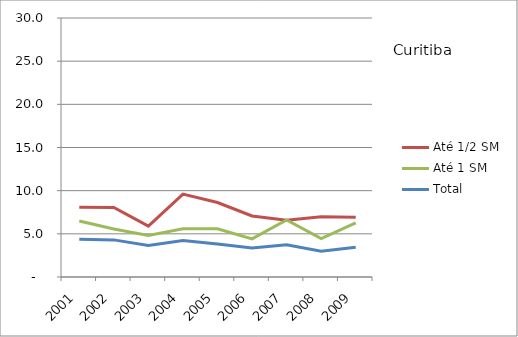
| Category | Até 1/2 SM | Até 1 SM | Total |
|---|---|---|---|
| 2001.0 | 8.09 | 6.49 | 4.38 |
| 2002.0 | 8.06 | 5.57 | 4.3 |
| 2003.0 | 5.89 | 4.82 | 3.64 |
| 2004.0 | 9.61 | 5.59 | 4.24 |
| 2005.0 | 8.63 | 5.59 | 3.82 |
| 2006.0 | 7.07 | 4.41 | 3.36 |
| 2007.0 | 6.57 | 6.62 | 3.73 |
| 2008.0 | 6.98 | 4.45 | 2.98 |
| 2009.0 | 6.93 | 6.27 | 3.45 |